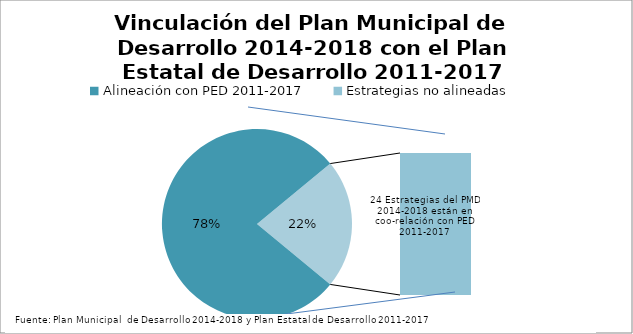
| Category | Plan Municipal de Desarrollo 2014-2018 |
|---|---|
| Alineación con PED 2011-2017 | 32 |
| Estrategias no alineadas | 9 |